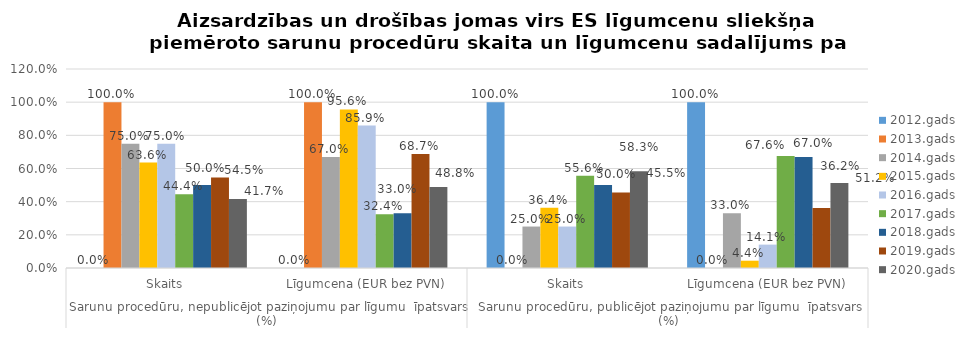
| Category | 2012.gads | 2013.gads | 2014.gads | 2015.gads | 2016.gads | 2017.gads | 2018.gads | 2019.gads | 2020.gads |
|---|---|---|---|---|---|---|---|---|---|
| 0 | 0 | 1 | 0.75 | 0.636 | 0.75 | 0.444 | 0.5 | 0.545 | 0.417 |
| 1 | 0 | 1 | 0.67 | 0.956 | 0.859 | 0.324 | 0.33 | 0.687 | 0.488 |
| 2 | 1 | 0 | 0.25 | 0.364 | 0.25 | 0.556 | 0.5 | 0.455 | 0.583 |
| 3 | 1 | 0 | 0.33 | 0.044 | 0.141 | 0.676 | 0.67 | 0.362 | 0.512 |